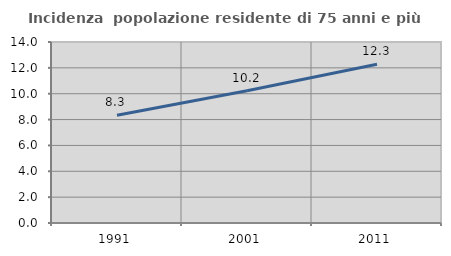
| Category | Incidenza  popolazione residente di 75 anni e più |
|---|---|
| 1991.0 | 8.333 |
| 2001.0 | 10.227 |
| 2011.0 | 12.276 |